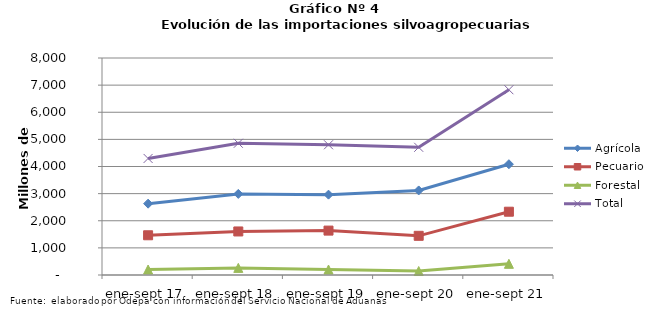
| Category | Agrícola | Pecuario | Forestal | Total |
|---|---|---|---|---|
| ene-sept 17 | 2629926 | 1464531 | 201873 | 4296330 |
| ene-sept 18 | 2989288 | 1605343 | 262118 | 4856749 |
| ene-sept 19 | 2962407 | 1636554 | 202106 | 4801067 |
| ene-sept 20 | 3117113 | 1444267 | 146471 | 4707851 |
| ene-sept 21 | 4084187 | 2333092 | 412350 | 6829629 |